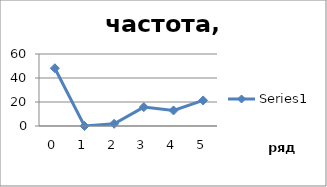
| Category | Series 0 |
|---|---|
| 0.0 | 48.148 |
| 1.0 | 0 |
| 2.0 | 1.852 |
| 3.0 | 15.741 |
| 4.0 | 12.963 |
| 5.0 | 21.296 |